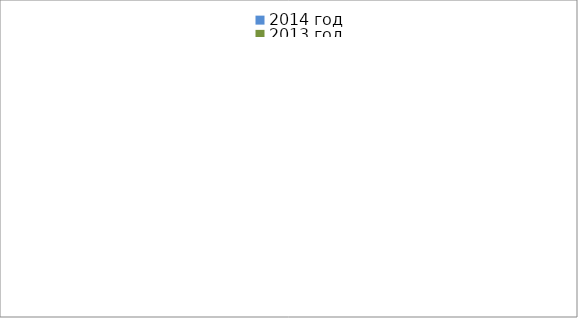
| Category | 2014 год | 2013 год |
|---|---|---|
|  - поджог | 13 | 25 |
|  - неосторожное обращение с огнём | 30 | 34 |
|  - НПТЭ электрооборудования | 15 | 18 |
|  - НПУ и Э печей | 47 | 36 |
|  - НПУ и Э транспортных средств | 47 | 44 |
|   -Шалость с огнем детей | 0 | 3 |
|  -НППБ при эксплуатации эл.приборов | 17 | 19 |
|  - курение | 17 | 9 |
| - прочие | 68 | 68 |
| - не установленные причины | 9 | 1 |